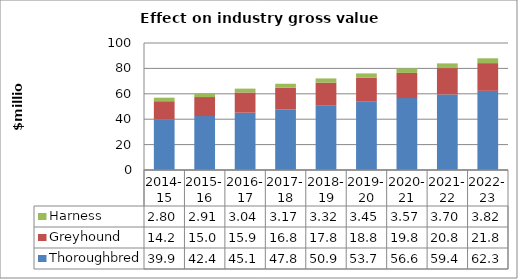
| Category | Thoroughbred | Greyhound | Harness |
|---|---|---|---|
| 2014-15 | 39.944 | 14.211 | 2.797 |
| 2015-16 | 42.424 | 15.019 | 2.914 |
| 2016-17 | 45.116 | 15.922 | 3.043 |
| 2017-18 | 47.893 | 16.85 | 3.175 |
| 2018-19 | 50.909 | 17.882 | 3.319 |
| 2019-20 | 53.748 | 18.848 | 3.448 |
| 2020-21 | 56.606 | 19.825 | 3.574 |
| 2021-22 | 59.464 | 20.804 | 3.696 |
| 2022-23 | 62.347 | 21.801 | 3.816 |